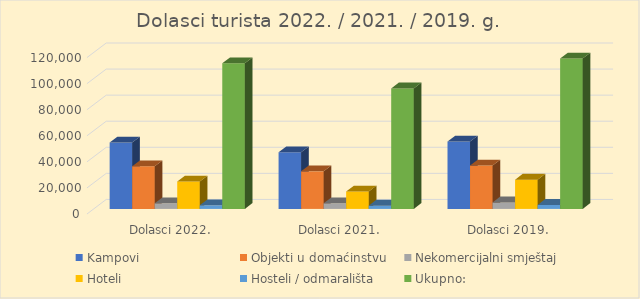
| Category | Kampovi | Objekti u domaćinstvu | Nekomercijalni smještaj | Hoteli | Hosteli / odmarališta | Ukupno: |
|---|---|---|---|---|---|---|
| Dolasci 2022. | 50964 | 32643 | 4308 | 21050 | 2801 | 111766 |
| Dolasci 2021. | 43408 | 28805 | 4322 | 13370 | 2514 | 92419 |
| Dolasci 2019. | 51685 | 33212 | 4962 | 22423 | 3044 | 115326 |